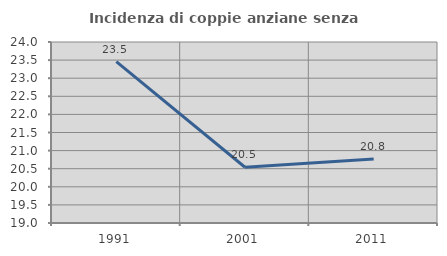
| Category | Incidenza di coppie anziane senza figli  |
|---|---|
| 1991.0 | 23.457 |
| 2001.0 | 20.541 |
| 2011.0 | 20.765 |